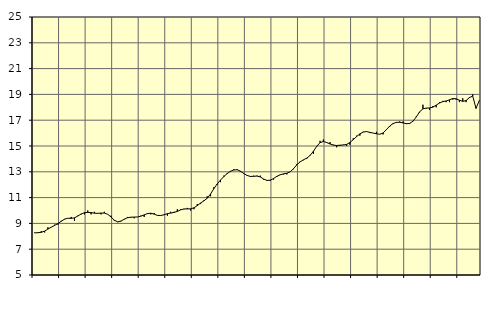
| Category | Piggar | Finansiell verksamhet, företagstjänster, SNI 64-82 |
|---|---|---|
| nan | 8.3 | 8.26 |
| 87.0 | 8.3 | 8.28 |
| 87.0 | 8.4 | 8.31 |
| 87.0 | 8.3 | 8.4 |
| nan | 8.7 | 8.56 |
| 88.0 | 8.7 | 8.71 |
| 88.0 | 8.9 | 8.84 |
| 88.0 | 8.9 | 8.99 |
| nan | 9.2 | 9.16 |
| 89.0 | 9.3 | 9.33 |
| 89.0 | 9.4 | 9.4 |
| 89.0 | 9.5 | 9.39 |
| nan | 9.2 | 9.43 |
| 90.0 | 9.6 | 9.57 |
| 90.0 | 9.7 | 9.73 |
| 90.0 | 9.7 | 9.83 |
| nan | 10 | 9.85 |
| 91.0 | 9.7 | 9.84 |
| 91.0 | 9.9 | 9.79 |
| 91.0 | 9.8 | 9.78 |
| nan | 9.7 | 9.8 |
| 92.0 | 9.9 | 9.8 |
| 92.0 | 9.7 | 9.71 |
| 92.0 | 9.6 | 9.5 |
| nan | 9.2 | 9.25 |
| 93.0 | 9.1 | 9.12 |
| 93.0 | 9.2 | 9.17 |
| 93.0 | 9.3 | 9.33 |
| nan | 9.5 | 9.44 |
| 94.0 | 9.5 | 9.48 |
| 94.0 | 9.4 | 9.49 |
| 94.0 | 9.5 | 9.5 |
| nan | 9.6 | 9.56 |
| 95.0 | 9.5 | 9.66 |
| 95.0 | 9.8 | 9.76 |
| 95.0 | 9.7 | 9.79 |
| nan | 9.8 | 9.72 |
| 96.0 | 9.6 | 9.62 |
| 96.0 | 9.6 | 9.61 |
| 96.0 | 9.7 | 9.67 |
| nan | 9.6 | 9.76 |
| 97.0 | 9.9 | 9.8 |
| 97.0 | 9.9 | 9.85 |
| 97.0 | 10.1 | 9.93 |
| nan | 10.1 | 10.05 |
| 98.0 | 10.1 | 10.12 |
| 98.0 | 10.2 | 10.12 |
| 98.0 | 10 | 10.13 |
| nan | 10.1 | 10.21 |
| 99.0 | 10.5 | 10.38 |
| 99.0 | 10.5 | 10.58 |
| 99.0 | 10.8 | 10.75 |
| nan | 11.1 | 10.95 |
| 0.0 | 11.1 | 11.28 |
| 0.0 | 11.8 | 11.69 |
| 0.0 | 12 | 12.06 |
| nan | 12.2 | 12.36 |
| 1.0 | 12.7 | 12.63 |
| 1.0 | 12.9 | 12.86 |
| 1.0 | 13 | 13.04 |
| nan | 13.2 | 13.14 |
| 2.0 | 13.2 | 13.16 |
| 2.0 | 13 | 13.05 |
| 2.0 | 12.9 | 12.87 |
| nan | 12.7 | 12.72 |
| 3.0 | 12.6 | 12.64 |
| 3.0 | 12.7 | 12.65 |
| 3.0 | 12.7 | 12.67 |
| nan | 12.7 | 12.6 |
| 4.0 | 12.4 | 12.44 |
| 4.0 | 12.3 | 12.33 |
| 4.0 | 12.3 | 12.35 |
| nan | 12.4 | 12.48 |
| 5.0 | 12.6 | 12.65 |
| 5.0 | 12.8 | 12.77 |
| 5.0 | 12.8 | 12.84 |
| nan | 12.8 | 12.89 |
| 6.0 | 13 | 13 |
| 6.0 | 13.2 | 13.24 |
| 6.0 | 13.6 | 13.54 |
| nan | 13.8 | 13.77 |
| 7.0 | 13.9 | 13.93 |
| 7.0 | 14 | 14.06 |
| 7.0 | 14.3 | 14.27 |
| nan | 14.4 | 14.59 |
| 8.0 | 15 | 14.97 |
| 8.0 | 15.4 | 15.26 |
| 8.0 | 15.5 | 15.35 |
| nan | 15.3 | 15.27 |
| 9.0 | 15.3 | 15.16 |
| 9.0 | 15.1 | 15.07 |
| 9.0 | 14.9 | 15.04 |
| nan | 15 | 15.06 |
| 10.0 | 15.1 | 15.08 |
| 10.0 | 15 | 15.12 |
| 10.0 | 15.1 | 15.27 |
| nan | 15.6 | 15.49 |
| 11.0 | 15.8 | 15.73 |
| 11.0 | 15.8 | 15.94 |
| 11.0 | 16.1 | 16.08 |
| nan | 16.1 | 16.12 |
| 12.0 | 16 | 16.06 |
| 12.0 | 16 | 16 |
| 12.0 | 16.1 | 15.95 |
| nan | 15.9 | 15.91 |
| 13.0 | 15.9 | 16.01 |
| 13.0 | 16.3 | 16.27 |
| 13.0 | 16.5 | 16.55 |
| nan | 16.7 | 16.74 |
| 14.0 | 16.8 | 16.83 |
| 14.0 | 16.9 | 16.84 |
| 14.0 | 16.9 | 16.79 |
| nan | 16.7 | 16.73 |
| 15.0 | 16.7 | 16.75 |
| 15.0 | 16.9 | 16.92 |
| 15.0 | 17.3 | 17.25 |
| nan | 17.6 | 17.65 |
| 16.0 | 18.2 | 17.88 |
| 16.0 | 17.9 | 17.94 |
| 16.0 | 17.8 | 17.95 |
| nan | 18.1 | 18.01 |
| 17.0 | 18 | 18.17 |
| 17.0 | 18.4 | 18.33 |
| 17.0 | 18.5 | 18.44 |
| nan | 18.4 | 18.49 |
| 18.0 | 18.4 | 18.58 |
| 18.0 | 18.6 | 18.68 |
| 18.0 | 18.6 | 18.66 |
| nan | 18.4 | 18.55 |
| 19.0 | 18.7 | 18.46 |
| 19.0 | 18.4 | 18.52 |
| 19.0 | 18.8 | 18.75 |
| nan | 19 | 18.87 |
| 20.0 | 18 | 17.92 |
| 20.0 | 18.5 | 18.53 |